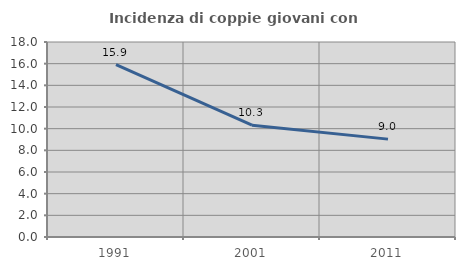
| Category | Incidenza di coppie giovani con figli |
|---|---|
| 1991.0 | 15.913 |
| 2001.0 | 10.321 |
| 2011.0 | 9.035 |